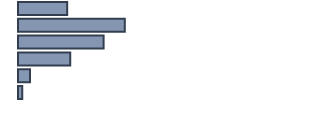
| Category | Series 0 |
|---|---|
| 0 | 15.866 |
| 1 | 34.447 |
| 2 | 27.615 |
| 3 | 16.849 |
| 4 | 3.847 |
| 5 | 1.376 |